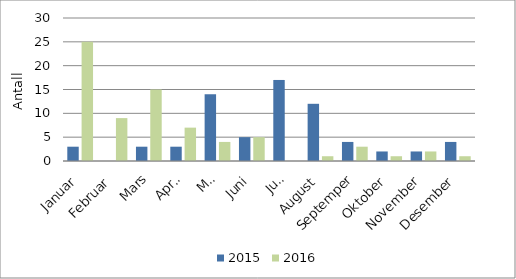
| Category | 2015 | 2016 |
|---|---|---|
| Januar | 3 | 25 |
| Februar | 0 | 9 |
| Mars | 3 | 15 |
| April | 3 | 7 |
| Mai | 14 | 4 |
| Juni | 5 | 5 |
| Juli | 17 | 0 |
| August | 12 | 1 |
| Septemper | 4 | 3 |
| Oktober | 2 | 1 |
| November | 2 | 2 |
| Desember | 4 | 1 |